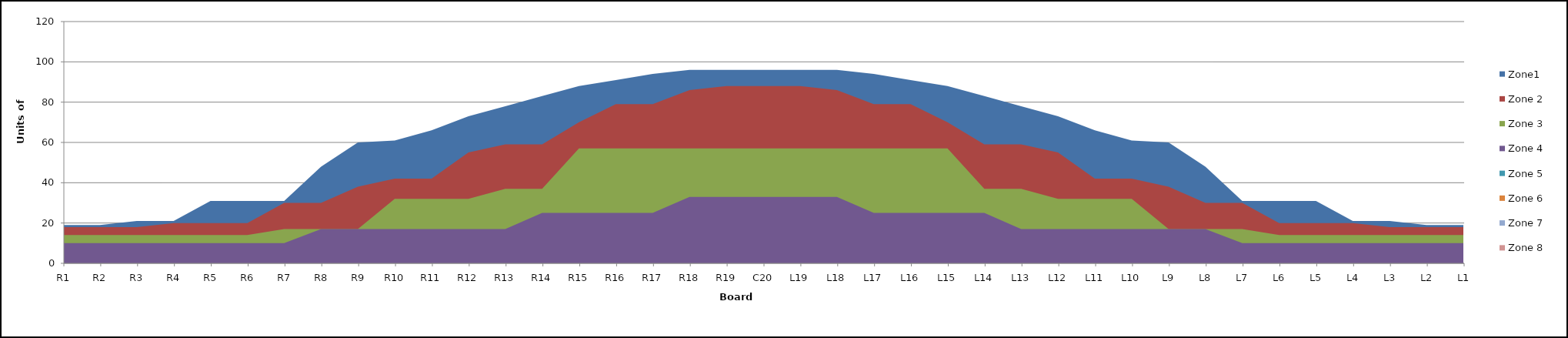
| Category | Zone1 | Zone 2 | Zone 3 | Zone 4 | Zone 5 | Zone 6 | Zone 7 | Zone 8 |
|---|---|---|---|---|---|---|---|---|
| L1 | 19 | 18 | 14 | 10 | 0 | 0 |  |  |
| L2 | 19 | 18 | 14 | 10 | 0 | 0 |  |  |
| L3 | 21 | 18 | 14 | 10 | 0 | 0 |  |  |
| L4 | 21 | 20 | 14 | 10 | 0 | 0 |  |  |
| L5 | 31 | 20 | 14 | 10 | 0 | 0 |  |  |
| L6 | 31 | 20 | 14 | 10 | 0 | 0 |  |  |
| L7 | 31 | 30 | 17 | 10 | 0 | 0 |  |  |
| L8 | 48 | 30 | 17 | 17 | 0 | 0 |  |  |
| L9 | 60 | 38 | 17 | 17 | 0 | 0 |  |  |
| L10 | 61 | 42 | 32 | 17 | 0 | 0 |  |  |
| L11 | 66 | 42 | 32 | 17 | 0 | 0 |  |  |
| L12 | 73 | 55 | 32 | 17 | 0 | 0 |  |  |
| L13 | 78 | 59 | 37 | 17 | 0 | 0 |  |  |
| L14 | 83 | 59 | 37 | 25 | 0 | 0 |  |  |
| L15 | 88 | 70 | 57 | 25 | 0 | 0 |  |  |
| L16 | 91 | 79 | 57 | 25 | 0 | 0 |  |  |
| L17 | 94 | 79 | 57 | 25 | 0 | 0 |  |  |
| L18 | 96 | 86 | 57 | 33 | 0 | 0 |  |  |
| L19 | 96 | 88 | 57 | 33 | 0 | 0 |  |  |
| C20 | 96 | 88 | 57 | 33 | 0 | 0 |  |  |
| R19 | 96 | 88 | 57 | 33 | 0 | 0 |  |  |
| R18 | 96 | 86 | 57 | 33 | 0 | 0 |  |  |
| R17 | 94 | 79 | 57 | 25 | 0 | 0 |  |  |
| R16 | 91 | 79 | 57 | 25 | 0 | 0 |  |  |
| R15 | 88 | 70 | 57 | 25 | 0 | 0 |  |  |
| R14 | 83 | 59 | 37 | 25 | 0 | 0 |  |  |
| R13 | 78 | 59 | 37 | 17 | 0 | 0 |  |  |
| R12 | 73 | 55 | 32 | 17 | 0 | 0 |  |  |
| R11 | 66 | 42 | 32 | 17 | 0 | 0 |  |  |
| R10 | 61 | 42 | 32 | 17 | 0 | 0 |  |  |
| R9 | 60 | 38 | 17 | 17 | 0 | 0 |  |  |
| R8 | 48 | 30 | 17 | 17 | 0 | 0 |  |  |
| R7 | 31 | 30 | 17 | 10 | 0 | 0 |  |  |
| R6 | 31 | 20 | 14 | 10 | 0 | 0 |  |  |
| R5 | 31 | 20 | 14 | 10 | 0 | 0 |  |  |
| R4 | 21 | 20 | 14 | 10 | 0 | 0 |  |  |
| R3 | 21 | 18 | 14 | 10 | 0 | 0 |  |  |
| R2 | 19 | 18 | 14 | 10 | 0 | 0 |  |  |
| R1 | 19 | 18 | 14 | 10 | 0 | 0 |  |  |